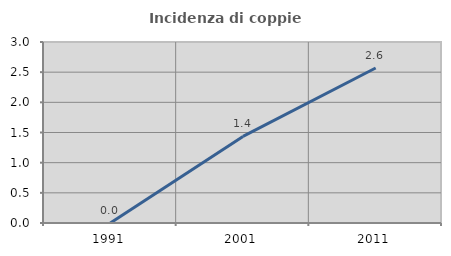
| Category | Incidenza di coppie miste |
|---|---|
| 1991.0 | 0 |
| 2001.0 | 1.435 |
| 2011.0 | 2.569 |